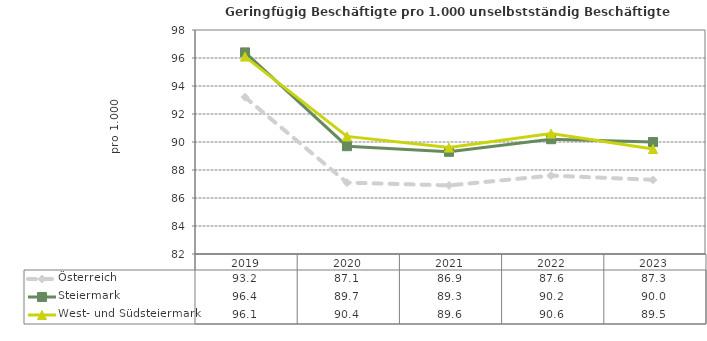
| Category | Österreich | Steiermark | West- und Südsteiermark |
|---|---|---|---|
| 2023.0 | 87.3 | 90 | 89.5 |
| 2022.0 | 87.6 | 90.2 | 90.6 |
| 2021.0 | 86.9 | 89.3 | 89.6 |
| 2020.0 | 87.1 | 89.7 | 90.4 |
| 2019.0 | 93.2 | 96.4 | 96.1 |